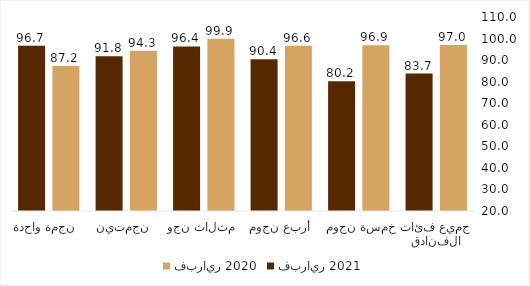
| Category | فبراير 2020 | فبراير 2021 |
|---|---|---|
| جميع فئات الفنادق | 96.978 | 83.746 |
|  خمسة نجوم  | 96.911 | 80.155 |
| أربع نجوم | 96.61 | 90.385 |
| ثلاث نجوم  | 99.867 | 96.351 |
| نجمتين  | 94.291 | 91.752 |
| نجمة واحدة  | 87.219 | 96.683 |